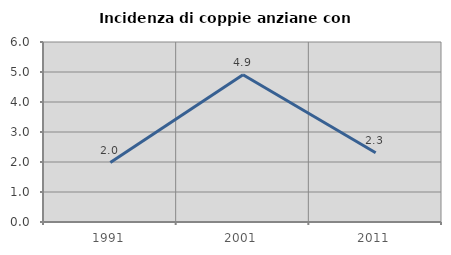
| Category | Incidenza di coppie anziane con figli |
|---|---|
| 1991.0 | 1.98 |
| 2001.0 | 4.91 |
| 2011.0 | 2.309 |